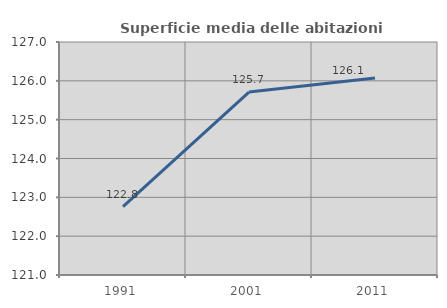
| Category | Superficie media delle abitazioni occupate |
|---|---|
| 1991.0 | 122.762 |
| 2001.0 | 125.711 |
| 2011.0 | 126.072 |